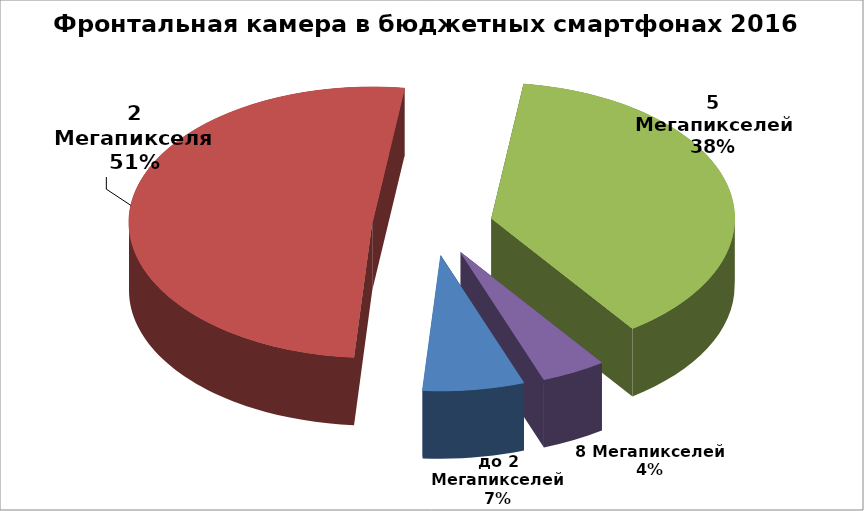
| Category | Series 0 |
|---|---|
| до 2 Мегапикселей | 11 |
| 2 Мегапикселя | 83 |
| 5 Мегапикселей | 62 |
| 8 Мегапикселей | 7 |